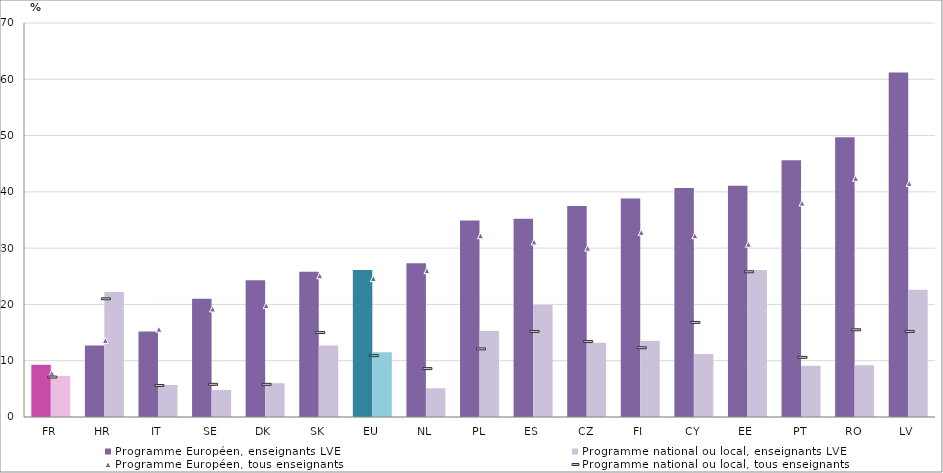
| Category | Programme Européen, enseignants LVE | Programme national ou local, enseignants LVE |
|---|---|---|
| 0 | 9.3 | 7.3 |
| 1 | 12.7 | 22.2 |
| 2 | 15.2 | 5.7 |
| 3 | 21 | 4.8 |
| 4 | 24.3 | 6 |
| 5 | 25.8 | 12.7 |
| 6 | 26.1 | 11.5 |
| 7 | 27.3 | 5.1 |
| 8 | 34.9 | 15.3 |
| 9 | 35.2 | 19.9 |
| 10 | 37.5 | 13.2 |
| 11 | 38.8 | 13.5 |
| 12 | 40.7 | 11.2 |
| 13 | 41.1 | 26.1 |
| 14 | 45.6 | 9.1 |
| 15 | 49.7 | 9.2 |
| 16 | 61.2 | 22.6 |